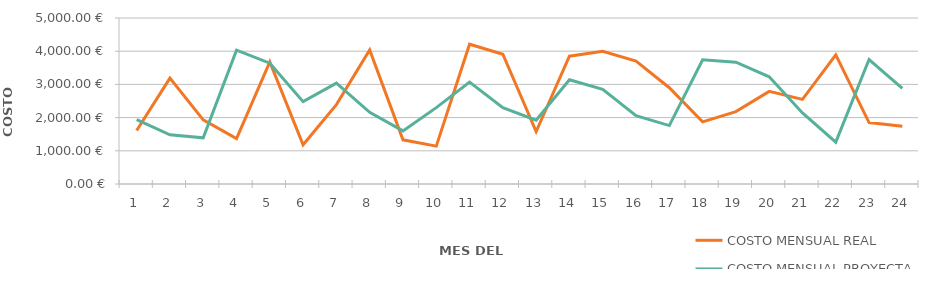
| Category | COSTO MENSUAL REAL | COSTO MENSUAL PROYECTADO |
|---|---|---|
| 1.0 | 1610 | 1940 |
| 2.0 | 3190 | 1480 |
| 3.0 | 1930 | 1390 |
| 4.0 | 1370 | 4030 |
| 5.0 | 3680 | 3640 |
| 6.0 | 1180 | 2480 |
| 7.0 | 2390 | 3040 |
| 8.0 | 4040 | 2160 |
| 9.0 | 1330 | 1600 |
| 10.0 | 1140 | 2300 |
| 11.0 | 4210 | 3070 |
| 12.0 | 3910 | 2300 |
| 13.0 | 1580 | 1920 |
| 14.0 | 3850 | 3140 |
| 15.0 | 4000 | 2850 |
| 16.0 | 3700 | 2060 |
| 17.0 | 2900 | 1760 |
| 18.0 | 1870 | 3740 |
| 19.0 | 2180 | 3670 |
| 20.0 | 2790 | 3230 |
| 21.0 | 2550 | 2140 |
| 22.0 | 3890 | 1260 |
| 23.0 | 1850 | 3750 |
| 24.0 | 1740 | 2880 |